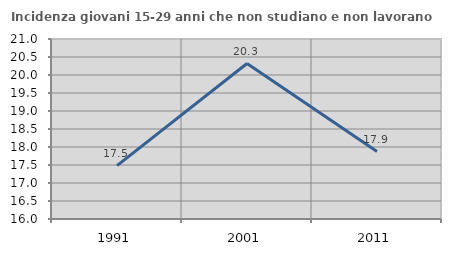
| Category | Incidenza giovani 15-29 anni che non studiano e non lavorano  |
|---|---|
| 1991.0 | 17.481 |
| 2001.0 | 20.318 |
| 2011.0 | 17.873 |